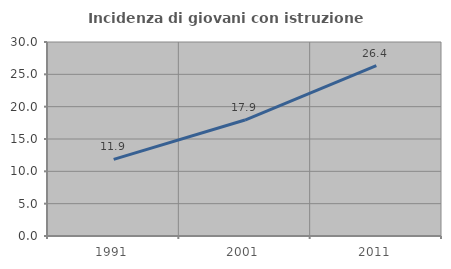
| Category | Incidenza di giovani con istruzione universitaria |
|---|---|
| 1991.0 | 11.855 |
| 2001.0 | 17.929 |
| 2011.0 | 26.358 |